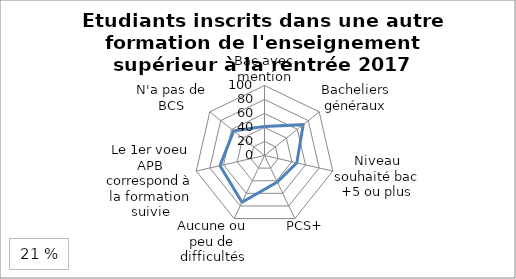
| Category | Etudiants inscrits dans une autre formation de l'enseignement supérieur à la rentrée 2017 |
|---|---|
| Bac avec mention | 41.6 |
| Bacheliers généraux | 70.7 |
| Niveau souhaité bac +5 ou plus | 47.4 |
| PCS+ | 42.1 |
| Aucune ou peu de difficultés | 74.2 |
| Le 1er voeu APB correspond à la formation suivie | 65.2 |
| N'a pas de BCS | 56.3 |